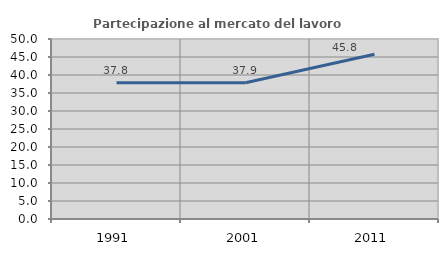
| Category | Partecipazione al mercato del lavoro  femminile |
|---|---|
| 1991.0 | 37.819 |
| 2001.0 | 37.869 |
| 2011.0 | 45.756 |